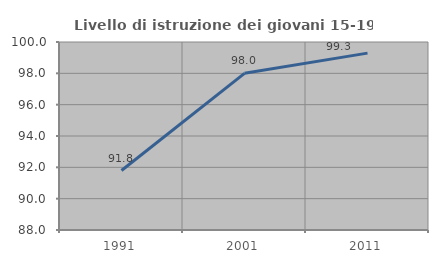
| Category | Livello di istruzione dei giovani 15-19 anni |
|---|---|
| 1991.0 | 91.796 |
| 2001.0 | 98 |
| 2011.0 | 99.291 |